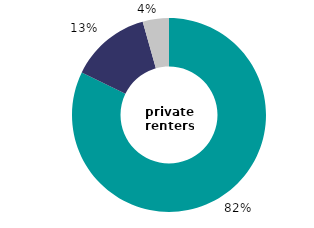
| Category | private 
renters |
|---|---|
| complaint not considered | 82.2 |
| complaint made | 13.43 |
| no complaint made | 4.369 |